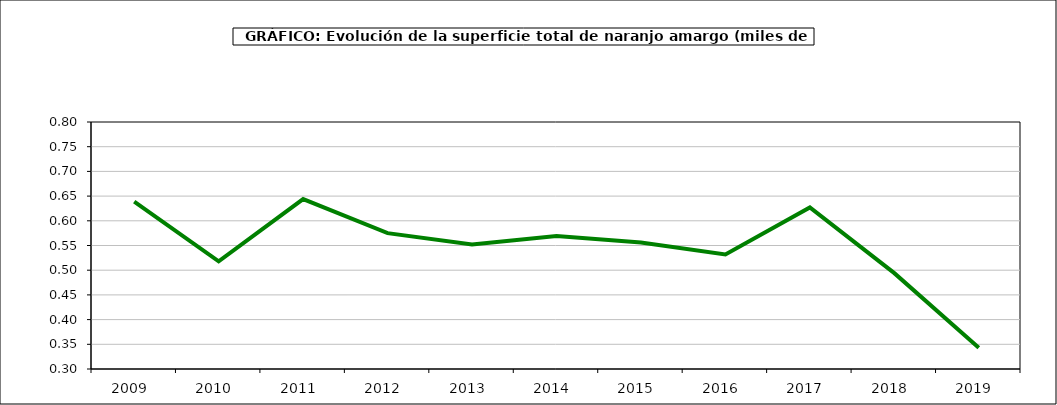
| Category | superficie |
|---|---|
| 2009.0 | 0.639 |
| 2010.0 | 0.518 |
| 2011.0 | 0.644 |
| 2012.0 | 0.575 |
| 2013.0 | 0.552 |
| 2014.0 | 0.569 |
| 2015.0 | 0.556 |
| 2016.0 | 0.532 |
| 2017.0 | 0.627 |
| 2018.0 | 0.494 |
| 2019.0 | 0.343 |